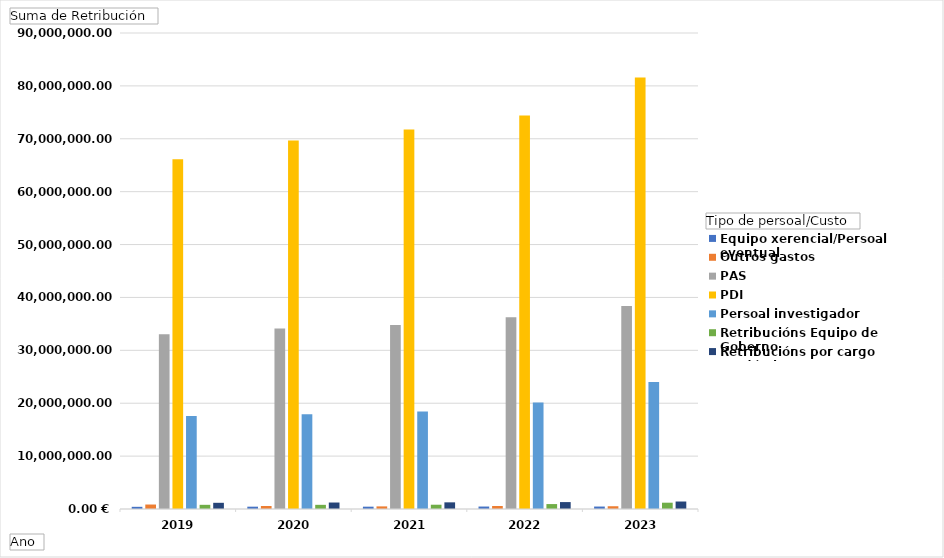
| Category | Equipo xerencial/Persoal eventual | Outros gastos | PAS | PDI | Persoal investigador | Retribucións Equipo de Goberno | Retribucións por cargo académico |
|---|---|---|---|---|---|---|---|
| 2019 | 412263.66 | 846632.88 | 33041828.83 | 66138863.12 | 17600789.84 | 790084.91 | 1172230.16 |
| 2020 | 440101.25 | 563841.64 | 34136555.31 | 69666572.955 | 17900266.91 | 787586.41 | 1225436.59 |
| 2021 | 439834.44 | 493929.61 | 34770547.71 | 71760878.7 | 18438960.2 | 808254.57 | 1258711.63 |
| 2022 | 466036.4 | 570907.36 | 36267915.09 | 74385998.07 | 20155107.82 | 932302.935 | 1307798.55 |
| 2023 | 463980.49 | 522178.71 | 38403765.62 | 81596849.07 | 24026155.92 | 1192353.47 | 1414986.24 |